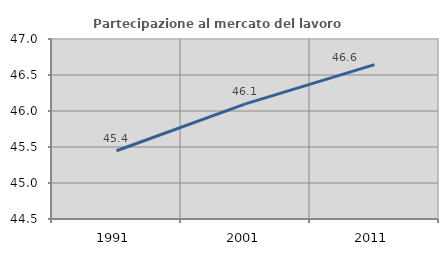
| Category | Partecipazione al mercato del lavoro  femminile |
|---|---|
| 1991.0 | 45.447 |
| 2001.0 | 46.1 |
| 2011.0 | 46.644 |